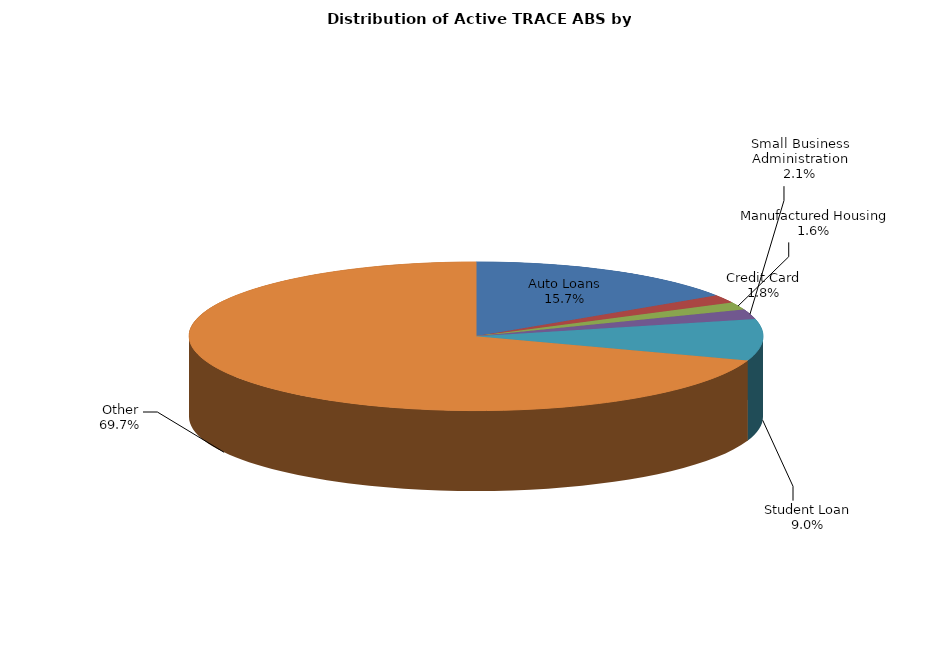
| Category | Series 0 |
|---|---|
| Auto Loans | 2514 |
| Credit Card | 282 |
| Manufactured Housing | 261 |
| Small Business Administration | 337 |
| Student Loan | 1440 |
| Other | 11143 |